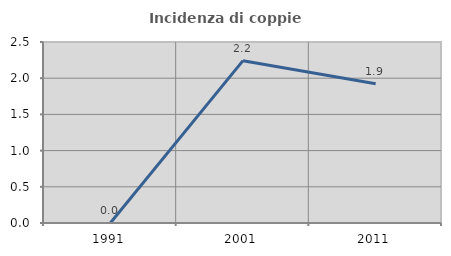
| Category | Incidenza di coppie miste |
|---|---|
| 1991.0 | 0 |
| 2001.0 | 2.242 |
| 2011.0 | 1.923 |